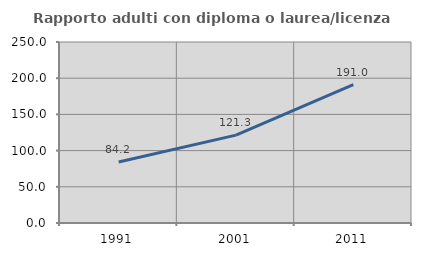
| Category | Rapporto adulti con diploma o laurea/licenza media  |
|---|---|
| 1991.0 | 84.188 |
| 2001.0 | 121.338 |
| 2011.0 | 191.018 |